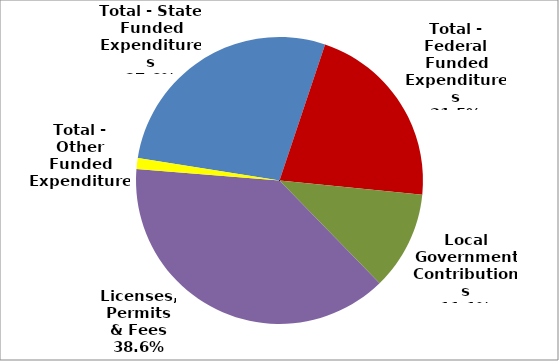
| Category | Series 0 |
|---|---|
| Total - State Funded Expenditures | 298605 |
| Total - Federal Funded Expenditures | 231640 |
| Local Government Contributions | 120176 |
| Licenses, Permits & Fees | 416520 |
| Total - Other Funded Expenditures | 13154 |